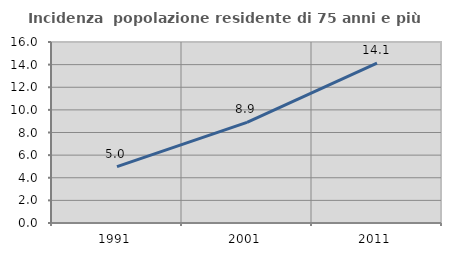
| Category | Incidenza  popolazione residente di 75 anni e più |
|---|---|
| 1991.0 | 4.98 |
| 2001.0 | 8.899 |
| 2011.0 | 14.132 |